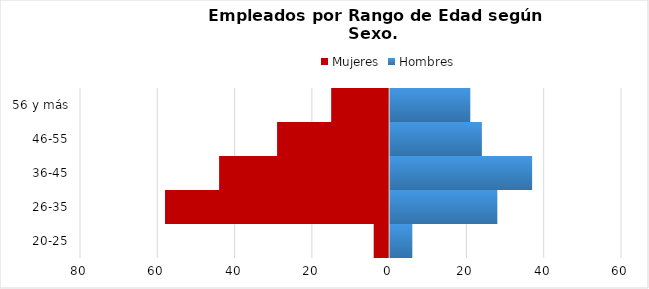
| Category | Mujeres | Hombres |
|---|---|---|
| 20-25 | -4 | 6 |
| 26-35 | -58 | 28 |
| 36-45 | -44 | 37 |
| 46-55 | -29 | 24 |
| 56 y más | -15 | 21 |